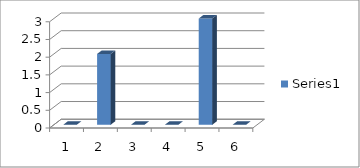
| Category | Series 0 |
|---|---|
| 0 | 0 |
| 1 | 2 |
| 2 | 0 |
| 3 | 0 |
| 4 | 3 |
| 5 | 0 |